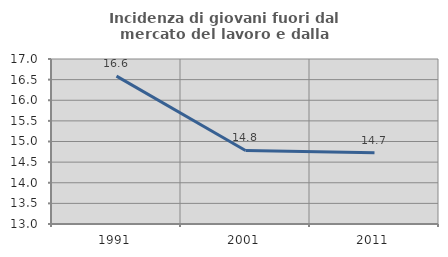
| Category | Incidenza di giovani fuori dal mercato del lavoro e dalla formazione  |
|---|---|
| 1991.0 | 16.585 |
| 2001.0 | 14.783 |
| 2011.0 | 14.729 |